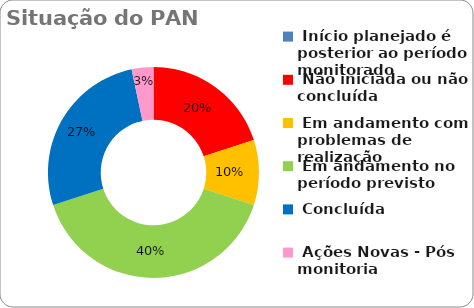
| Category | Series 0 |
|---|---|
|  Início planejado é posterior ao período monitorado | 0 |
|  Não iniciada ou não concluída | 0.2 |
|  Em andamento com problemas de realização | 0.1 |
|  Em andamento no período previsto  | 0.4 |
|  Concluída | 0.267 |
|  Ações Novas - Pós monitoria | 0.033 |